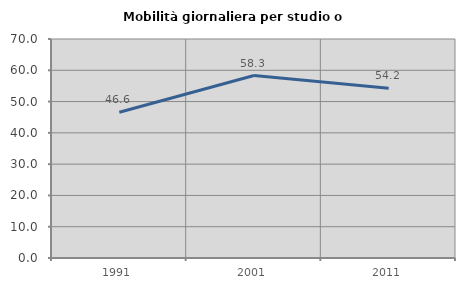
| Category | Mobilità giornaliera per studio o lavoro |
|---|---|
| 1991.0 | 46.608 |
| 2001.0 | 58.333 |
| 2011.0 | 54.248 |